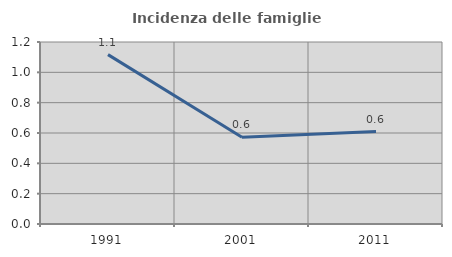
| Category | Incidenza delle famiglie numerose |
|---|---|
| 1991.0 | 1.117 |
| 2001.0 | 0.571 |
| 2011.0 | 0.609 |